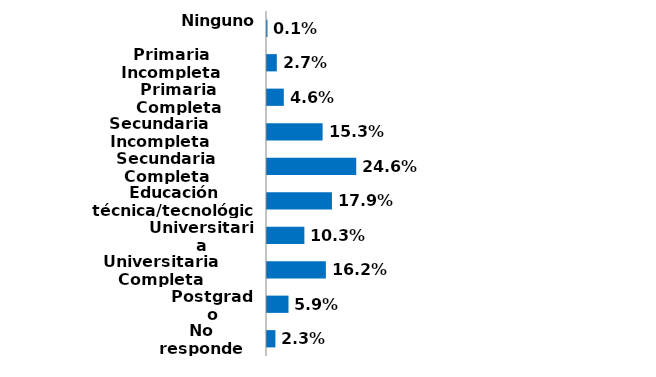
| Category | Series 0 |
|---|---|
| Ninguno | 0.001 |
| Primaria Incompleta | 0.027 |
| Primaria Completa | 0.046 |
| Secundaria Incompleta | 0.153 |
| Secundaria Completa | 0.246 |
| Educación técnica/tecnológica | 0.179 |
| Universitaria Incompleta | 0.103 |
| Universitaria Completa | 0.162 |
| Postgrado | 0.059 |
| No responde | 0.023 |